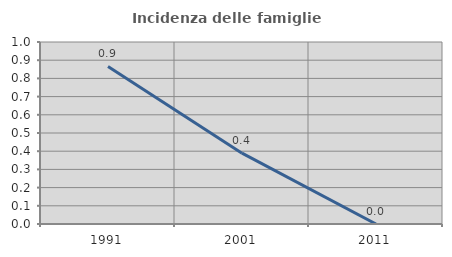
| Category | Incidenza delle famiglie numerose |
|---|---|
| 1991.0 | 0.866 |
| 2001.0 | 0.389 |
| 2011.0 | 0 |